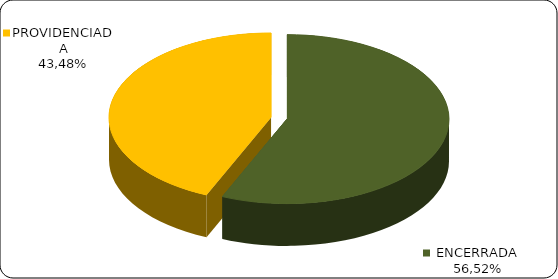
| Category | Series 0 |
|---|---|
|      ENCERRADA | 0.565 |
|      PROVIDENCIADA | 0.435 |